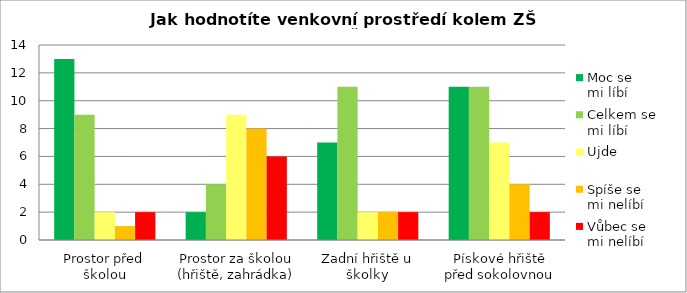
| Category | Moc se 
mi líbí | Celkem se 
mi líbí | Ujde | Spíše se 
mi nelíbí | Vůbec se 
mi nelíbí |
|---|---|---|---|---|---|
| Prostor před školou | 13 | 9 | 2 | 1 | 2 |
| Prostor za školou (hřiště, zahrádka) | 2 | 4 | 9 | 8 | 6 |
| Zadní hřiště u školky | 7 | 11 | 2 | 2 | 2 |
| Pískové hřiště před sokolovnou | 11 | 11 | 7 | 4 | 2 |